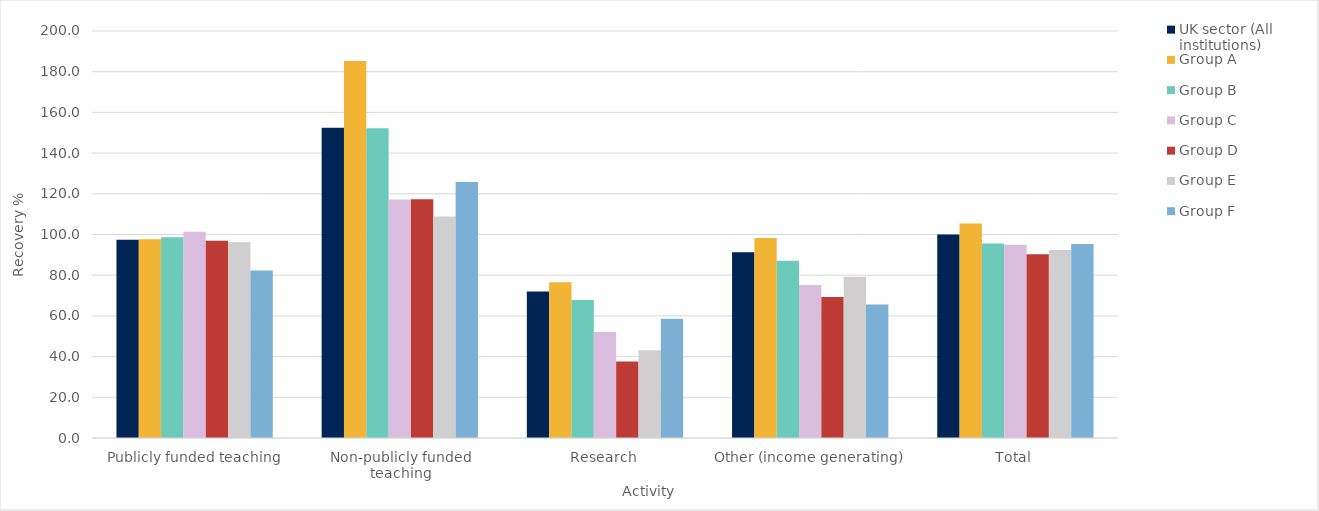
| Category | UK sector (All institutions) | Group A | Group B | Group C | Group D | Group E | Group F |
|---|---|---|---|---|---|---|---|
| 0 | 97.452 | 97.635 | 98.609 | 101.312 | 96.971 | 96.209 | 82.354 |
| 1 | 152.509 | 185.23 | 152.22 | 117.138 | 117.329 | 108.833 | 125.773 |
| 2 | 72.009 | 76.578 | 67.815 | 52.101 | 37.588 | 43.144 | 58.608 |
| 3 | 91.319 | 98.303 | 87.121 | 75.176 | 69.346 | 79.253 | 65.578 |
| 4 | 99.955 | 105.451 | 95.52 | 94.959 | 90.251 | 92.339 | 95.325 |